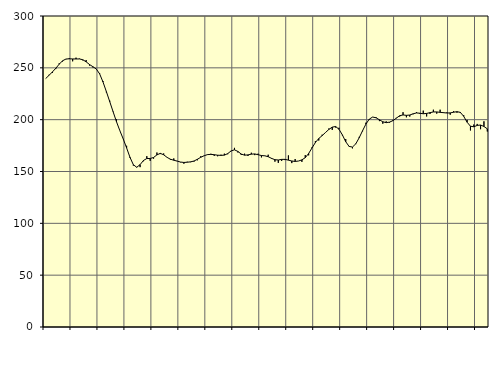
| Category | Piggar | Series 1 |
|---|---|---|
| nan | 239.7 | 239.65 |
| 87.0 | 243.3 | 242.8 |
| 87.0 | 245.1 | 246.07 |
| 87.0 | 248.8 | 249.6 |
| nan | 254.3 | 253.47 |
| 88.0 | 256.1 | 256.8 |
| 88.0 | 258.3 | 258.48 |
| 88.0 | 259.5 | 258.73 |
| nan | 256.3 | 258.58 |
| 89.0 | 259.8 | 258.54 |
| 89.0 | 258.9 | 258.57 |
| 89.0 | 257.2 | 257.83 |
| nan | 257.5 | 255.8 |
| 90.0 | 252.2 | 253.21 |
| 90.0 | 250.4 | 251.1 |
| 90.0 | 249 | 248.9 |
| nan | 244.9 | 244.19 |
| 91.0 | 237.2 | 236.37 |
| 91.0 | 226.3 | 227.07 |
| 91.0 | 218.3 | 217.39 |
| nan | 208 | 207.63 |
| 92.0 | 200.3 | 198.05 |
| 92.0 | 189.3 | 189.4 |
| 92.0 | 181.3 | 181.42 |
| nan | 174.8 | 172.77 |
| 93.0 | 163.1 | 163.76 |
| 93.0 | 155.7 | 156.57 |
| 93.0 | 154.4 | 154.07 |
| nan | 154.2 | 156.63 |
| 94.0 | 159.9 | 160.62 |
| 94.0 | 164.8 | 162.52 |
| 94.0 | 160.3 | 162.56 |
| nan | 162.4 | 163.52 |
| 95.0 | 168.3 | 166.03 |
| 95.0 | 166.8 | 167.49 |
| 95.0 | 167.4 | 166.12 |
| nan | 163.7 | 163.63 |
| 96.0 | 161.3 | 161.84 |
| 96.0 | 162.6 | 160.87 |
| 96.0 | 160.2 | 160.03 |
| nan | 158.9 | 159.11 |
| 97.0 | 157.5 | 158.73 |
| 97.0 | 159.4 | 158.95 |
| 97.0 | 159 | 159.32 |
| nan | 159.6 | 160.12 |
| 98.0 | 160.8 | 161.78 |
| 98.0 | 164.7 | 163.71 |
| 98.0 | 165.1 | 165.22 |
| nan | 166.5 | 166.29 |
| 99.0 | 167.1 | 166.52 |
| 99.0 | 165.1 | 166.19 |
| 99.0 | 164.7 | 165.73 |
| nan | 166.2 | 165.56 |
| 0.0 | 167.2 | 165.79 |
| 0.0 | 166.7 | 167.25 |
| 0.0 | 169.6 | 169.86 |
| nan | 172.8 | 170.91 |
| 1.0 | 168.4 | 169.36 |
| 1.0 | 166 | 166.88 |
| 1.0 | 167.2 | 165.74 |
| nan | 165 | 166.01 |
| 2.0 | 168.1 | 166.73 |
| 2.0 | 165.8 | 166.95 |
| 2.0 | 167.2 | 166.2 |
| nan | 163.6 | 165.4 |
| 3.0 | 165 | 165.14 |
| 3.0 | 166.2 | 164.27 |
| 3.0 | 162.2 | 162.65 |
| nan | 159.5 | 161.38 |
| 4.0 | 158.3 | 161.1 |
| 4.0 | 160.2 | 161.69 |
| 4.0 | 161 | 161.72 |
| nan | 165.5 | 160.95 |
| 5.0 | 158.1 | 160.13 |
| 5.0 | 162 | 159.7 |
| 5.0 | 160.1 | 160.11 |
| nan | 159.3 | 161.24 |
| 6.0 | 165.8 | 163.33 |
| 6.0 | 165.6 | 167.36 |
| 6.0 | 173.3 | 172.71 |
| nan | 179.3 | 177.95 |
| 7.0 | 179.9 | 181.82 |
| 7.0 | 185.5 | 184.58 |
| 7.0 | 187.5 | 187.61 |
| nan | 191.5 | 190.58 |
| 8.0 | 190.1 | 192.79 |
| 8.0 | 192.4 | 193.4 |
| 8.0 | 192.2 | 190.78 |
| nan | 184.9 | 185.36 |
| 9.0 | 181.3 | 178.74 |
| 9.0 | 173.9 | 174.18 |
| 9.0 | 172.3 | 173.58 |
| nan | 176.4 | 176.76 |
| 10.0 | 183.4 | 182.59 |
| 10.0 | 188.8 | 189.38 |
| 10.0 | 197.1 | 195.77 |
| nan | 200.1 | 200.58 |
| 11.0 | 202.6 | 202.54 |
| 11.0 | 202.4 | 201.81 |
| 11.0 | 198.6 | 199.88 |
| nan | 196.1 | 197.98 |
| 12.0 | 198.4 | 197.13 |
| 12.0 | 197.1 | 197.63 |
| 12.0 | 199.8 | 199.04 |
| nan | 201.8 | 201.42 |
| 13.0 | 203 | 203.8 |
| 13.0 | 207.2 | 204.55 |
| 13.0 | 202.3 | 204.16 |
| nan | 203 | 204.48 |
| 14.0 | 205.2 | 205.68 |
| 14.0 | 207.3 | 206.5 |
| 14.0 | 205.6 | 206.2 |
| nan | 208.7 | 205.7 |
| 15.0 | 203.1 | 206.03 |
| 15.0 | 205.5 | 206.76 |
| 15.0 | 209.6 | 207.45 |
| nan | 205.8 | 207.47 |
| 16.0 | 209.6 | 207.05 |
| 16.0 | 207.1 | 206.76 |
| 16.0 | 207 | 206.41 |
| nan | 204.8 | 206.53 |
| 17.0 | 208.2 | 207.17 |
| 17.0 | 206.7 | 207.72 |
| 17.0 | 206.4 | 207.02 |
| nan | 204.3 | 203.22 |
| 18.0 | 199.8 | 197.56 |
| 18.0 | 189.6 | 193.65 |
| 18.0 | 195.3 | 193.13 |
| nan | 195.9 | 194.44 |
| 19.0 | 190.8 | 194.83 |
| 19.0 | 198.4 | 193.43 |
| 19.0 | 188.6 | 191.16 |